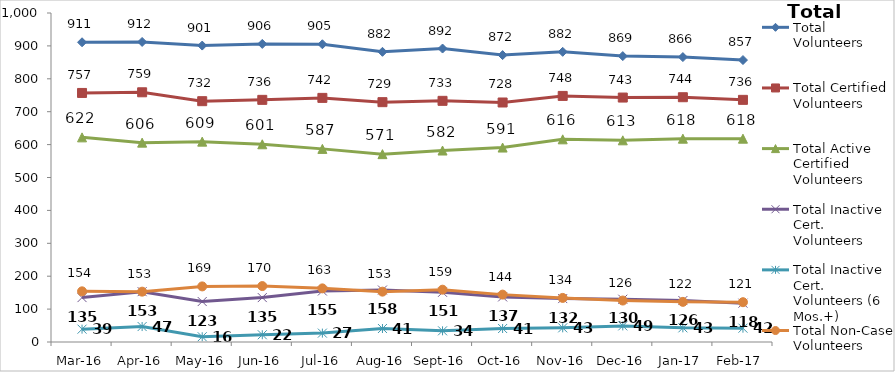
| Category | Total Volunteers | Total Certified Volunteers | Total Active Certified Volunteers | Total Inactive Cert. Volunteers | Total Inactive Cert. Volunteers (6 Mos.+) | Total Non-Case Volunteers |
|---|---|---|---|---|---|---|
| Mar-16 | 911 | 757 | 622 | 135 | 39 | 154 |
| Apr-16 | 912 | 759 | 606 | 153 | 47 | 153 |
| May-16 | 901 | 732 | 609 | 123 | 16 | 169 |
| Jun-16 | 906 | 736 | 601 | 135 | 22 | 170 |
| Jul-16 | 905 | 742 | 587 | 155 | 27 | 163 |
| Aug-16 | 882 | 729 | 571 | 158 | 41 | 153 |
| Sep-16 | 892 | 733 | 582 | 151 | 34 | 159 |
| Oct-16 | 872 | 728 | 591 | 137 | 41 | 144 |
| Nov-16 | 882 | 748 | 616 | 132 | 43 | 134 |
| Dec-16 | 869 | 743 | 613 | 130 | 49 | 126 |
| Jan-17 | 866 | 744 | 618 | 126 | 43 | 122 |
| Feb-17 | 857 | 736 | 618 | 118 | 42 | 121 |